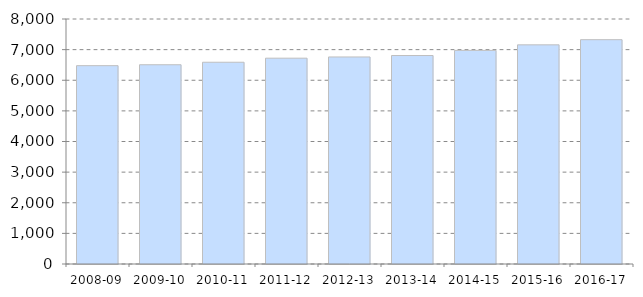
| Category | Average patient list size per practice |
|---|---|
| 2008-09 | 6476.44 |
| 2009-10 | 6506.581 |
| 2010-11 | 6587.778 |
| 2011-12 | 6720.544 |
| 2012-13 | 6760.637 |
| 2013-14 | 6807.563 |
| 2014-15 | 6975.362 |
| 2015-16 | 7156.214 |
| 2016-17 | 7324.755 |